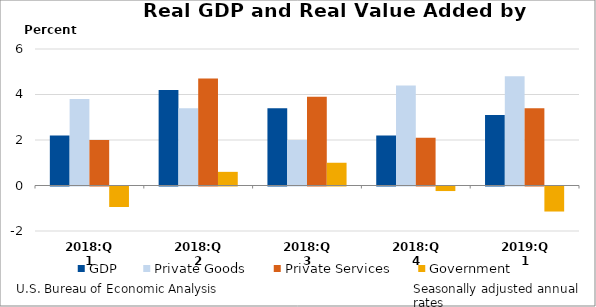
| Category | GDP | Private Goods | Private Services | Government |
|---|---|---|---|---|
| 2018:Q1 | 2.2 | 3.8 | 2 | -0.9 |
| 2018:Q2 | 4.2 | 3.4 | 4.7 | 0.6 |
| 2018:Q3 | 3.4 | 2 | 3.9 | 1 |
| 2018:Q4 | 2.2 | 4.4 | 2.1 | -0.2 |
| 2019:Q1 | 3.1 | 4.8 | 3.4 | -1.1 |